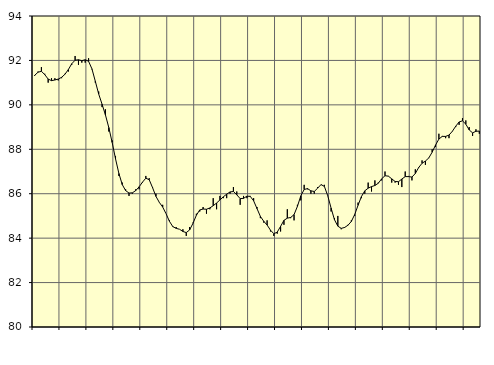
| Category | Piggar | Series 1 |
|---|---|---|
| nan | 91.3 | 91.33 |
| 87.0 | 91.5 | 91.47 |
| 87.0 | 91.7 | 91.51 |
| 87.0 | 91.4 | 91.36 |
| nan | 91 | 91.16 |
| 88.0 | 91.2 | 91.09 |
| 88.0 | 91.2 | 91.12 |
| 88.0 | 91.1 | 91.16 |
| nan | 91.2 | 91.24 |
| 89.0 | 91.4 | 91.38 |
| 89.0 | 91.5 | 91.59 |
| 89.0 | 91.8 | 91.85 |
| nan | 92.2 | 92.01 |
| 90.0 | 91.8 | 92.03 |
| 90.0 | 91.9 | 91.99 |
| 90.0 | 91.9 | 92.03 |
| nan | 92.1 | 91.96 |
| 91.0 | 91.6 | 91.62 |
| 91.0 | 91 | 91.06 |
| 91.0 | 90.6 | 90.49 |
| nan | 89.9 | 90.03 |
| 92.0 | 89.8 | 89.55 |
| 92.0 | 88.8 | 88.98 |
| 92.0 | 88.4 | 88.31 |
| nan | 87.7 | 87.57 |
| 93.0 | 86.8 | 86.91 |
| 93.0 | 86.5 | 86.41 |
| 93.0 | 86.2 | 86.14 |
| nan | 85.9 | 86.03 |
| 94.0 | 86 | 86.04 |
| 94.0 | 86.2 | 86.14 |
| 94.0 | 86.2 | 86.31 |
| nan | 86.5 | 86.52 |
| 95.0 | 86.8 | 86.7 |
| 95.0 | 86.7 | 86.63 |
| 95.0 | 86.3 | 86.27 |
| nan | 86 | 85.88 |
| 96.0 | 85.6 | 85.61 |
| 96.0 | 85.5 | 85.4 |
| 96.0 | 85.1 | 85.1 |
| nan | 84.8 | 84.76 |
| 97.0 | 84.5 | 84.52 |
| 97.0 | 84.5 | 84.44 |
| 97.0 | 84.4 | 84.4 |
| nan | 84.4 | 84.3 |
| 98.0 | 84.1 | 84.25 |
| 98.0 | 84.5 | 84.37 |
| 98.0 | 84.7 | 84.67 |
| nan | 85.1 | 85.03 |
| 99.0 | 85.2 | 85.27 |
| 99.0 | 85.4 | 85.31 |
| 99.0 | 85.1 | 85.3 |
| nan | 85.3 | 85.36 |
| 0.0 | 85.8 | 85.46 |
| 0.0 | 85.3 | 85.58 |
| 0.0 | 85.9 | 85.72 |
| nan | 85.8 | 85.86 |
| 1.0 | 85.8 | 85.98 |
| 1.0 | 86 | 86.08 |
| 1.0 | 86.3 | 86.1 |
| nan | 86.1 | 85.95 |
| 2.0 | 85.5 | 85.78 |
| 2.0 | 85.9 | 85.79 |
| 2.0 | 85.8 | 85.89 |
| nan | 85.9 | 85.88 |
| 3.0 | 85.8 | 85.68 |
| 3.0 | 85.4 | 85.33 |
| 3.0 | 84.9 | 84.98 |
| nan | 84.7 | 84.76 |
| 4.0 | 84.8 | 84.59 |
| 4.0 | 84.3 | 84.36 |
| 4.0 | 84.1 | 84.2 |
| nan | 84.2 | 84.27 |
| 5.0 | 84.3 | 84.53 |
| 5.0 | 84.6 | 84.8 |
| 5.0 | 85.3 | 84.9 |
| nan | 84.9 | 84.93 |
| 6.0 | 84.8 | 85.06 |
| 6.0 | 85.5 | 85.43 |
| 6.0 | 85.7 | 85.9 |
| nan | 86.4 | 86.19 |
| 7.0 | 86.2 | 86.23 |
| 7.0 | 86 | 86.13 |
| 7.0 | 86 | 86.1 |
| nan | 86.3 | 86.25 |
| 8.0 | 86.4 | 86.41 |
| 8.0 | 86.4 | 86.33 |
| 8.0 | 85.9 | 85.91 |
| nan | 85.2 | 85.35 |
| 9.0 | 84.9 | 84.83 |
| 9.0 | 85 | 84.54 |
| 9.0 | 84.4 | 84.44 |
| nan | 84.5 | 84.48 |
| 10.0 | 84.6 | 84.58 |
| 10.0 | 84.8 | 84.75 |
| 10.0 | 85 | 85.06 |
| nan | 85.6 | 85.48 |
| 11.0 | 85.8 | 85.87 |
| 11.0 | 86 | 86.13 |
| 11.0 | 86.5 | 86.25 |
| nan | 86.1 | 86.32 |
| 12.0 | 86.6 | 86.37 |
| 12.0 | 86.5 | 86.47 |
| 12.0 | 86.6 | 86.67 |
| nan | 87 | 86.81 |
| 13.0 | 86.8 | 86.79 |
| 13.0 | 86.5 | 86.67 |
| 13.0 | 86.5 | 86.55 |
| nan | 86.4 | 86.54 |
| 14.0 | 86.3 | 86.66 |
| 14.0 | 87 | 86.77 |
| 14.0 | 86.8 | 86.77 |
| nan | 86.6 | 86.75 |
| 15.0 | 87.1 | 86.91 |
| 15.0 | 87.2 | 87.18 |
| 15.0 | 87.5 | 87.37 |
| nan | 87.3 | 87.47 |
| 16.0 | 87.6 | 87.61 |
| 16.0 | 88 | 87.87 |
| 16.0 | 88.1 | 88.19 |
| nan | 88.7 | 88.46 |
| 17.0 | 88.6 | 88.58 |
| 17.0 | 88.5 | 88.58 |
| 17.0 | 88.5 | 88.64 |
| nan | 88.8 | 88.81 |
| 18.0 | 89 | 89.04 |
| 18.0 | 89.1 | 89.23 |
| 18.0 | 89.4 | 89.28 |
| nan | 89.3 | 89.13 |
| 19.0 | 89 | 88.87 |
| 19.0 | 88.6 | 88.74 |
| 19.0 | 88.9 | 88.81 |
| nan | 88.7 | 88.82 |